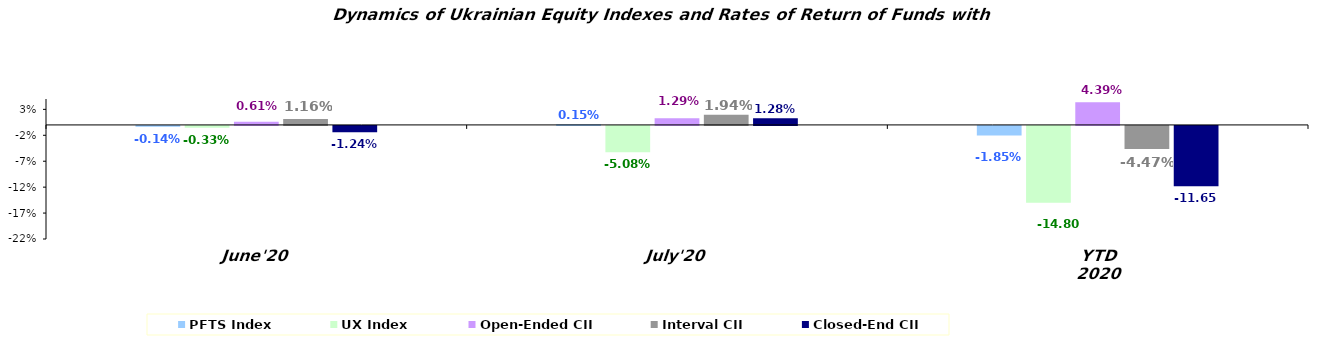
| Category | PFTS Index | UX Index | Open-Ended CII | Interval CII | Closed-End CII |
|---|---|---|---|---|---|
| June'20 | -0.001 | -0.003 | 0.006 | 0.012 | -0.012 |
| July'20 | 0.002 | -0.051 | 0.013 | 0.019 | 0.013 |
| YTD 2020 | -0.019 | -0.148 | 0.044 | -0.045 | -0.116 |